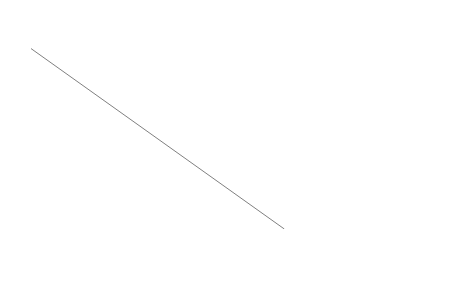
| Category | Series 0 |
|---|---|
| 0.0 | 80 |
| 1.0 | 0 |